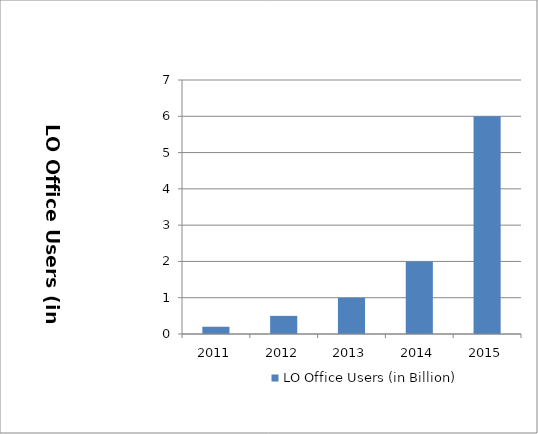
| Category | LO Office Users (in Billion) |
|---|---|
| 2011.0 | 0.2 |
| 2012.0 | 0.5 |
| 2013.0 | 1 |
| 2014.0 | 2 |
| 2015.0 | 6 |